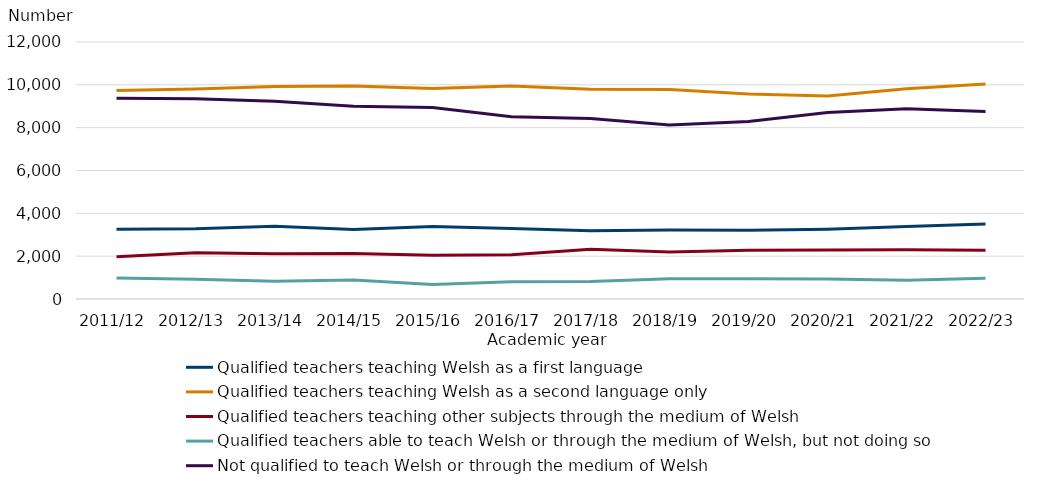
| Category | Qualified teachers teaching Welsh as a first language  | Qualified teachers teaching Welsh as a second language only  | Qualified teachers teaching other subjects through the medium of Welsh  | Qualified teachers able to teach Welsh or through the medium of Welsh, but not doing so  | Not qualified to teach Welsh or through the medium of Welsh |
|---|---|---|---|---|---|
| 2011/12 | 3255 | 9730 | 1970 | 980 | 9370 |
| 2012/13 | 3275 | 9810 | 2160 | 920 | 9350 |
| 2013/14 | 3395 | 9925 | 2110 | 825 | 9235 |
| 2014/15 | 3250 | 9940 | 2120 | 885 | 8995 |
| 2015/16 | 3380 | 9830 | 2045 | 680 | 8940 |
| 2016/17 | 3295 | 9950 | 2065 | 810 | 8515 |
| 2017/18 | 3190 | 9795 | 2325 | 815 | 8430 |
| 2018/19 | 3220 | 9780 | 2190 | 940 | 8120 |
| 2019/20 | 3215 | 9570 | 2280 | 945 | 8285 |
| 2020/21 | 3260 | 9480 | 2285 | 935 | 8705 |
| 2021/22 | 3380 | 9815 | 2295 | 870 | 8880 |
| 2022/23 | 3505 | 10035 | 2280 | 965 | 8750 |